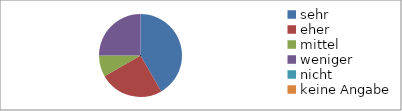
| Category | Series 0 |
|---|---|
| sehr | 5 |
| eher | 3 |
| mittel | 1 |
| weniger | 3 |
| nicht  | 0 |
| keine Angabe | 0 |